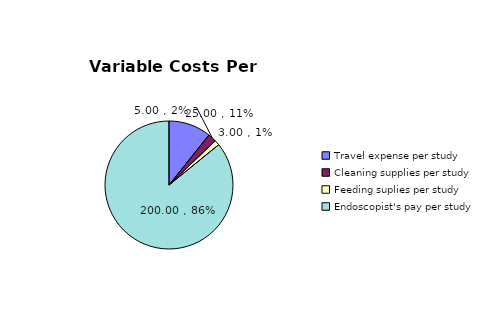
| Category | Series 0 |
|---|---|
| Travel expense per study | 25 |
| Cleaning supplies per study | 5 |
| Feeding suplies per study | 3 |
| Endoscopist's pay per study | 200 |